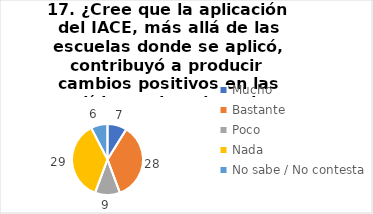
| Category | 17. ¿Cree que la aplicación del IACE, más allá de las escuelas donde se aplicó, contribuyó a producir cambios positivos en las políticas educativas de su provincia? |
|---|---|
| Mucho  | 0.089 |
| Bastante  | 0.354 |
| Poco  | 0.114 |
| Nada  | 0.367 |
| No sabe / No contesta | 0.076 |